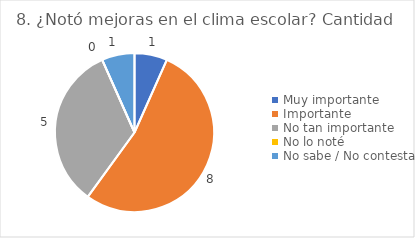
| Category | 8. ¿Notó mejoras en el clima escolar? |
|---|---|
| Muy importante  | 0.067 |
| Importante  | 0.533 |
| No tan importante  | 0.333 |
| No lo noté  | 0 |
| No sabe / No contesta | 0.067 |